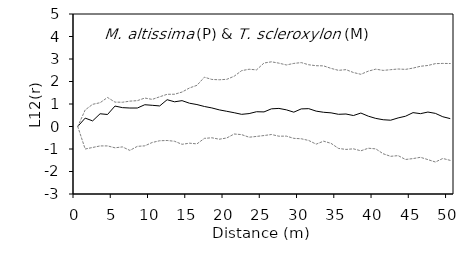
| Category | L12(r) | E12- | E12+ |
|---|---|---|---|
| 0.0 | 0 | 0 | 0 |
| 1.0 | 0.373 | -1 | 0.736 |
| 2.0 | 0.249 | -0.932 | 0.985 |
| 3.0 | 0.566 | -0.863 | 1.057 |
| 4.0 | 0.534 | -0.863 | 1.29 |
| 5.0 | 0.909 | -0.947 | 1.084 |
| 6.0 | 0.839 | -0.907 | 1.078 |
| 7.0 | 0.821 | -1.063 | 1.127 |
| 8.0 | 0.821 | -0.883 | 1.149 |
| 9.0 | 0.968 | -0.859 | 1.264 |
| 10.0 | 0.942 | -0.71 | 1.205 |
| 11.0 | 0.914 | -0.633 | 1.32 |
| 12.0 | 1.191 | -0.622 | 1.431 |
| 13.0 | 1.097 | -0.657 | 1.434 |
| 14.0 | 1.149 | -0.791 | 1.531 |
| 15.0 | 1.035 | -0.742 | 1.713 |
| 16.0 | 0.975 | -0.772 | 1.83 |
| 17.0 | 0.889 | -0.528 | 2.192 |
| 18.0 | 0.825 | -0.501 | 2.091 |
| 19.0 | 0.739 | -0.565 | 2.077 |
| 20.0 | 0.676 | -0.51 | 2.096 |
| 21.0 | 0.612 | -0.333 | 2.235 |
| 22.0 | 0.541 | -0.361 | 2.482 |
| 23.0 | 0.574 | -0.476 | 2.545 |
| 24.0 | 0.657 | -0.441 | 2.517 |
| 25.0 | 0.648 | -0.402 | 2.821 |
| 26.0 | 0.785 | -0.356 | 2.875 |
| 27.0 | 0.804 | -0.431 | 2.816 |
| 28.0 | 0.741 | -0.428 | 2.735 |
| 29.0 | 0.637 | -0.527 | 2.804 |
| 30.0 | 0.782 | -0.545 | 2.84 |
| 31.0 | 0.794 | -0.621 | 2.744 |
| 32.0 | 0.683 | -0.784 | 2.702 |
| 33.0 | 0.632 | -0.652 | 2.695 |
| 34.0 | 0.606 | -0.749 | 2.583 |
| 35.0 | 0.542 | -0.974 | 2.495 |
| 36.0 | 0.555 | -1.019 | 2.527 |
| 37.0 | 0.487 | -0.993 | 2.4 |
| 38.0 | 0.598 | -1.08 | 2.32 |
| 39.0 | 0.459 | -0.965 | 2.46 |
| 40.0 | 0.36 | -0.994 | 2.549 |
| 41.0 | 0.3 | -1.212 | 2.493 |
| 42.0 | 0.279 | -1.325 | 2.525 |
| 43.0 | 0.381 | -1.295 | 2.556 |
| 44.0 | 0.457 | -1.466 | 2.539 |
| 45.0 | 0.616 | -1.426 | 2.596 |
| 46.0 | 0.571 | -1.369 | 2.677 |
| 47.0 | 0.642 | -1.472 | 2.712 |
| 48.0 | 0.583 | -1.578 | 2.794 |
| 49.0 | 0.433 | -1.421 | 2.804 |
| 50.0 | 0.35 | -1.506 | 2.799 |